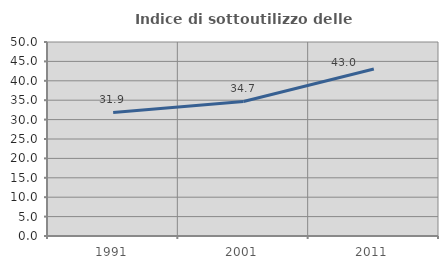
| Category | Indice di sottoutilizzo delle abitazioni  |
|---|---|
| 1991.0 | 31.852 |
| 2001.0 | 34.677 |
| 2011.0 | 43.024 |